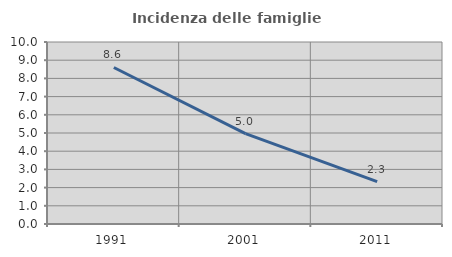
| Category | Incidenza delle famiglie numerose |
|---|---|
| 1991.0 | 8.601 |
| 2001.0 | 4.967 |
| 2011.0 | 2.331 |